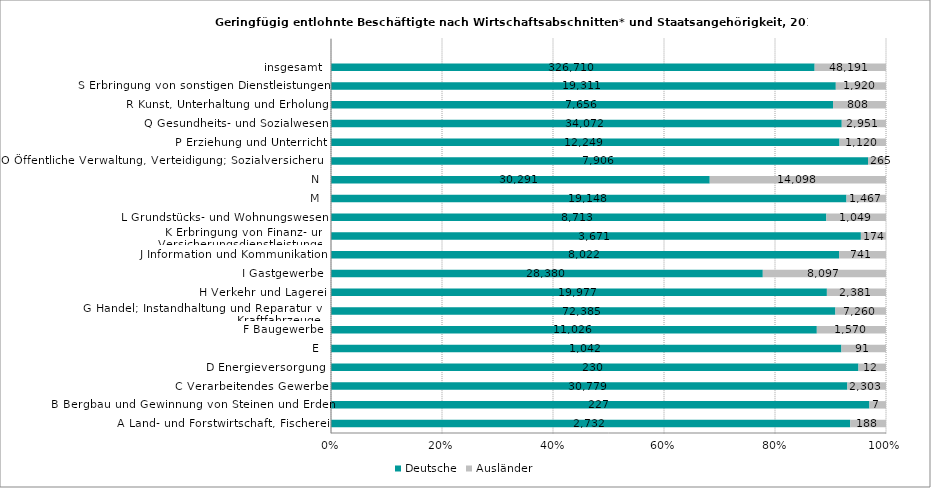
| Category | Deutsche | Ausländer |
|---|---|---|
| A Land- und Forstwirtschaft, Fischerei | 2732 | 188 |
| B Bergbau und Gewinnung von Steinen und Erden | 227 | 7 |
| C Verarbeitendes Gewerbe | 30779 | 2303 |
| D Energieversorgung | 230 | 12 |
| E | 1042 | 91 |
| F Baugewerbe | 11026 | 1570 |
| G Handel; Instandhaltung und Reparatur von Kraftfahrzeugen | 72385 | 7260 |
| H Verkehr und Lagerei | 19977 | 2381 |
| I Gastgewerbe | 28380 | 8097 |
| J Information und Kommunikation | 8022 | 741 |
| K Erbringung von Finanz- und Versicherungsdienstleistungen | 3671 | 174 |
| L Grundstücks- und Wohnungswesen | 8713 | 1049 |
| M | 19148 | 1467 |
| N | 30291 | 14098 |
| O Öffentliche Verwaltung, Verteidigung; Sozialversicherung | 7906 | 265 |
| P Erziehung und Unterricht | 12249 | 1120 |
| Q Gesundheits- und Sozialwesen | 34072 | 2951 |
| R Kunst, Unterhaltung und Erholung | 7656 | 808 |
| S Erbringung von sonstigen Dienstleistungen | 19311 | 1920 |
| insgesamt | 326710 | 48191 |